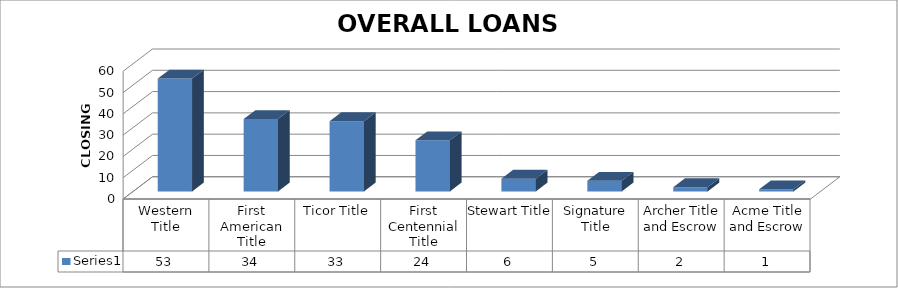
| Category | Series 0 |
|---|---|
| Western Title | 53 |
| First American Title | 34 |
| Ticor Title | 33 |
| First Centennial Title | 24 |
| Stewart Title | 6 |
| Signature Title | 5 |
| Archer Title and Escrow | 2 |
| Acme Title and Escrow | 1 |